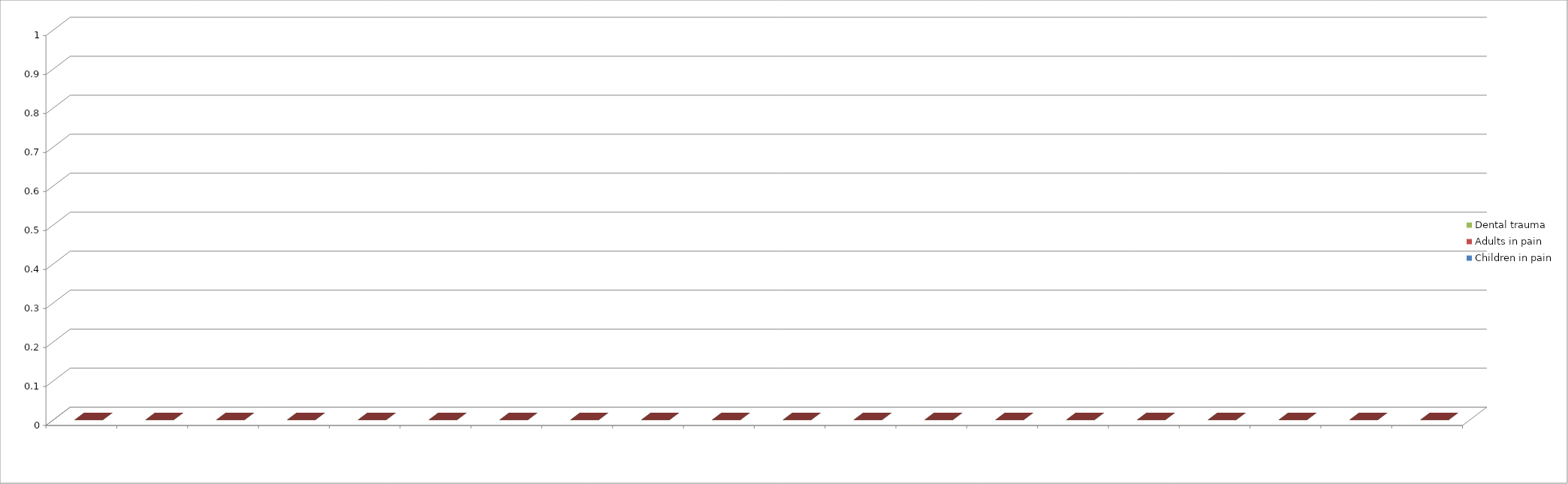
| Category | Children in pain | Adults in pain | Dental trauma |
|---|---|---|---|
| 0 | 0 | 0 | 0 |
| 1 | 0 | 0 | 0 |
| 2 | 0 | 0 | 0 |
| 3 | 0 | 0 | 0 |
| 4 | 0 | 0 | 0 |
| 5 | 0 | 0 | 0 |
| 6 | 0 | 0 | 0 |
| 7 | 0 | 0 | 0 |
| 8 | 0 | 0 | 0 |
| 9 | 0 | 0 | 0 |
| 10 | 0 | 0 | 0 |
| 11 | 0 | 0 | 0 |
| 12 | 0 | 0 | 0 |
| 13 | 0 | 0 | 0 |
| 14 | 0 | 0 | 0 |
| 15 | 0 | 0 | 0 |
| 16 | 0 | 0 | 0 |
| 17 | 0 | 0 | 0 |
| 18 | 0 | 0 | 0 |
| 19 | 0 | 0 | 0 |